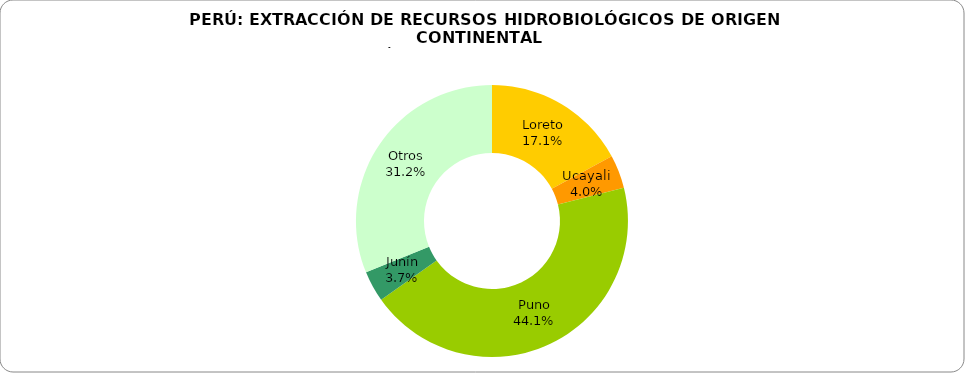
| Category | Series 0 |
|---|---|
| Loreto | 13230.65 |
| Ucayali | 3058.54 |
| Puno | 34073.95 |
| Junín | 2845.2 |
| Otros | 24081.13 |